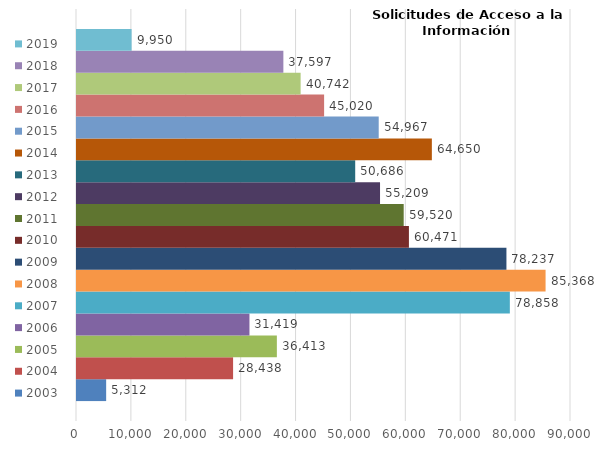
| Category | 2003 | 2004 | 2005 | 2006 | 2007 | 2008 | 2009 | 2010 | 2011 | 2012 | 2013 | 2014 | 2015 | 2016 | 2017 | 2018 | 2019 |
|---|---|---|---|---|---|---|---|---|---|---|---|---|---|---|---|---|---|
| 0 | 5312 | 28438 | 36413 | 31419 | 78858 | 85368 | 78237 | 60471 | 59520 | 55209 | 50686 | 64650 | 54967 | 45020 | 40742 | 37597 | 9950 |